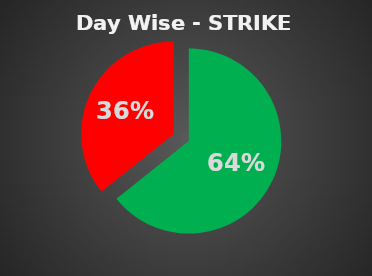
| Category | Series 0 |
|---|---|
| 0 | 0.643 |
| 1 | 0.357 |